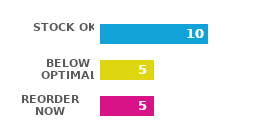
| Category | Series 0 |
|---|---|
| STOCK OK | 10 |
| BELOW OPTIMAL | 5 |
| REORDER NOW | 5 |